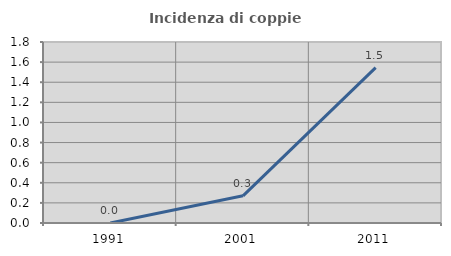
| Category | Incidenza di coppie miste |
|---|---|
| 1991.0 | 0 |
| 2001.0 | 0.27 |
| 2011.0 | 1.545 |